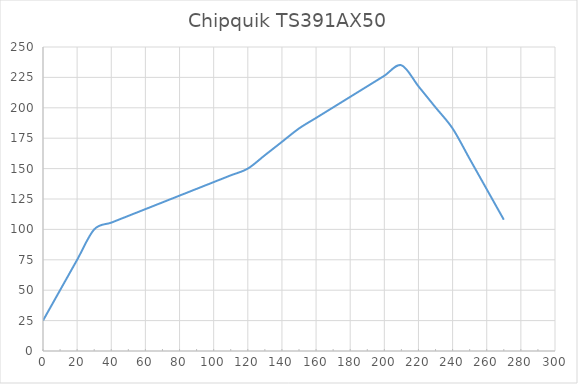
| Category | Chipquik TS391AX50 |
|---|---|
| 0.0 | 25 |
| 10.0 | 50 |
| 20.0 | 75 |
| 30.0 | 100 |
| 40.0 | 105.556 |
| 50.0 | 111.111 |
| 60.0 | 116.667 |
| 70.0 | 122.222 |
| 80.0 | 127.778 |
| 90.0 | 133.333 |
| 100.0 | 138.889 |
| 110.0 | 144.444 |
| 120.0 | 150 |
| 130.0 | 161 |
| 140.0 | 172 |
| 150.0 | 183 |
| 160.0 | 191.667 |
| 170.0 | 200.333 |
| 180.0 | 209 |
| 190.0 | 217.667 |
| 200.0 | 226.333 |
| 210.0 | 235 |
| 220.0 | 217.667 |
| 230.0 | 200.333 |
| 240.0 | 183 |
| 250.0 | 158 |
| 260.0 | 133 |
| 270.0 | 108 |